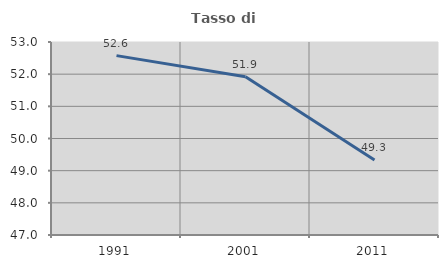
| Category | Tasso di occupazione   |
|---|---|
| 1991.0 | 52.577 |
| 2001.0 | 51.917 |
| 2011.0 | 49.333 |